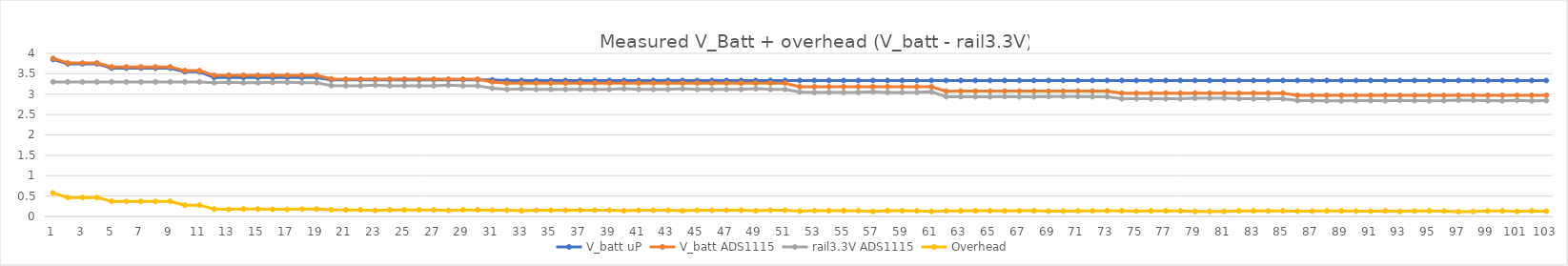
| Category | V_batt uP | V_batt ADS1115 | rail3.3V ADS1115 | Overhead |
|---|---|---|---|---|
| 0 | 3.851 | 3.878 | 3.3 | 0.577 |
| 1 | 3.745 | 3.765 | 3.3 | 0.465 |
| 2 | 3.745 | 3.765 | 3.3 | 0.465 |
| 3 | 3.745 | 3.766 | 3.3 | 0.465 |
| 4 | 3.639 | 3.669 | 3.3 | 0.369 |
| 5 | 3.639 | 3.669 | 3.3 | 0.369 |
| 6 | 3.639 | 3.669 | 3.3 | 0.369 |
| 7 | 3.639 | 3.669 | 3.3 | 0.369 |
| 8 | 3.639 | 3.67 | 3.3 | 0.369 |
| 9 | 3.548 | 3.577 | 3.3 | 0.276 |
| 10 | 3.548 | 3.577 | 3.3 | 0.277 |
| 11 | 3.411 | 3.462 | 3.281 | 0.18 |
| 12 | 3.411 | 3.463 | 3.29 | 0.173 |
| 13 | 3.411 | 3.463 | 3.282 | 0.181 |
| 14 | 3.411 | 3.463 | 3.282 | 0.181 |
| 15 | 3.411 | 3.463 | 3.29 | 0.173 |
| 16 | 3.411 | 3.462 | 3.29 | 0.173 |
| 17 | 3.411 | 3.463 | 3.282 | 0.181 |
| 18 | 3.411 | 3.463 | 3.282 | 0.181 |
| 19 | 3.351 | 3.374 | 3.211 | 0.163 |
| 20 | 3.351 | 3.367 | 3.206 | 0.16 |
| 21 | 3.351 | 3.367 | 3.207 | 0.16 |
| 22 | 3.351 | 3.366 | 3.219 | 0.147 |
| 23 | 3.351 | 3.367 | 3.207 | 0.16 |
| 24 | 3.351 | 3.366 | 3.207 | 0.16 |
| 25 | 3.351 | 3.367 | 3.206 | 0.16 |
| 26 | 3.351 | 3.366 | 3.207 | 0.159 |
| 27 | 3.351 | 3.366 | 3.219 | 0.147 |
| 28 | 3.351 | 3.367 | 3.207 | 0.16 |
| 29 | 3.351 | 3.367 | 3.207 | 0.16 |
| 30 | 3.351 | 3.3 | 3.146 | 0.154 |
| 31 | 3.335 | 3.268 | 3.118 | 0.15 |
| 32 | 3.335 | 3.27 | 3.132 | 0.139 |
| 33 | 3.335 | 3.27 | 3.119 | 0.152 |
| 34 | 3.335 | 3.27 | 3.119 | 0.152 |
| 35 | 3.335 | 3.27 | 3.119 | 0.152 |
| 36 | 3.335 | 3.27 | 3.119 | 0.151 |
| 37 | 3.335 | 3.27 | 3.119 | 0.152 |
| 38 | 3.335 | 3.27 | 3.119 | 0.152 |
| 39 | 3.335 | 3.27 | 3.132 | 0.139 |
| 40 | 3.335 | 3.27 | 3.119 | 0.152 |
| 41 | 3.335 | 3.27 | 3.119 | 0.152 |
| 42 | 3.335 | 3.27 | 3.119 | 0.152 |
| 43 | 3.335 | 3.27 | 3.132 | 0.139 |
| 44 | 3.335 | 3.27 | 3.119 | 0.151 |
| 45 | 3.335 | 3.27 | 3.119 | 0.152 |
| 46 | 3.335 | 3.27 | 3.119 | 0.151 |
| 47 | 3.335 | 3.27 | 3.119 | 0.152 |
| 48 | 3.335 | 3.27 | 3.132 | 0.138 |
| 49 | 3.335 | 3.27 | 3.119 | 0.152 |
| 50 | 3.335 | 3.27 | 3.119 | 0.152 |
| 51 | 3.335 | 3.183 | 3.052 | 0.131 |
| 52 | 3.335 | 3.182 | 3.043 | 0.139 |
| 53 | 3.335 | 3.182 | 3.044 | 0.138 |
| 54 | 3.335 | 3.182 | 3.042 | 0.14 |
| 55 | 3.335 | 3.182 | 3.045 | 0.137 |
| 56 | 3.335 | 3.182 | 3.058 | 0.124 |
| 57 | 3.335 | 3.182 | 3.044 | 0.139 |
| 58 | 3.335 | 3.182 | 3.044 | 0.139 |
| 59 | 3.335 | 3.182 | 3.046 | 0.136 |
| 60 | 3.335 | 3.182 | 3.057 | 0.125 |
| 61 | 3.335 | 3.073 | 2.938 | 0.135 |
| 62 | 3.335 | 3.074 | 2.937 | 0.137 |
| 63 | 3.335 | 3.074 | 2.936 | 0.138 |
| 64 | 3.335 | 3.074 | 2.936 | 0.138 |
| 65 | 3.335 | 3.074 | 2.941 | 0.133 |
| 66 | 3.335 | 3.074 | 2.936 | 0.138 |
| 67 | 3.335 | 3.074 | 2.936 | 0.138 |
| 68 | 3.335 | 3.074 | 2.944 | 0.131 |
| 69 | 3.335 | 3.074 | 2.944 | 0.131 |
| 70 | 3.335 | 3.074 | 2.941 | 0.134 |
| 71 | 3.335 | 3.074 | 2.937 | 0.137 |
| 72 | 3.335 | 3.074 | 2.936 | 0.138 |
| 73 | 3.335 | 3.024 | 2.887 | 0.137 |
| 74 | 3.335 | 3.021 | 2.891 | 0.13 |
| 75 | 3.335 | 3.023 | 2.887 | 0.136 |
| 76 | 3.335 | 3.024 | 2.886 | 0.137 |
| 77 | 3.335 | 3.024 | 2.886 | 0.137 |
| 78 | 3.335 | 3.023 | 2.899 | 0.124 |
| 79 | 3.335 | 3.023 | 2.899 | 0.124 |
| 80 | 3.335 | 3.023 | 2.899 | 0.124 |
| 81 | 3.335 | 3.024 | 2.886 | 0.137 |
| 82 | 3.335 | 3.024 | 2.886 | 0.137 |
| 83 | 3.335 | 3.024 | 2.89 | 0.133 |
| 84 | 3.335 | 3.024 | 2.886 | 0.137 |
| 85 | 3.335 | 2.972 | 2.843 | 0.13 |
| 86 | 3.335 | 2.972 | 2.842 | 0.131 |
| 87 | 3.335 | 2.973 | 2.838 | 0.135 |
| 88 | 3.335 | 2.972 | 2.837 | 0.136 |
| 89 | 3.335 | 2.973 | 2.842 | 0.131 |
| 90 | 3.335 | 2.972 | 2.843 | 0.13 |
| 91 | 3.335 | 2.973 | 2.839 | 0.134 |
| 92 | 3.335 | 2.972 | 2.85 | 0.123 |
| 93 | 3.335 | 2.973 | 2.84 | 0.133 |
| 94 | 3.335 | 2.973 | 2.836 | 0.136 |
| 95 | 3.335 | 2.972 | 2.841 | 0.131 |
| 96 | 3.335 | 2.972 | 2.854 | 0.119 |
| 97 | 3.335 | 2.973 | 2.849 | 0.123 |
| 98 | 3.335 | 2.973 | 2.84 | 0.133 |
| 99 | 3.335 | 2.973 | 2.836 | 0.136 |
| 100 | 3.335 | 2.972 | 2.85 | 0.123 |
| 101 | 3.335 | 2.972 | 2.836 | 0.136 |
| 102 | 3.335 | 2.972 | 2.843 | 0.13 |